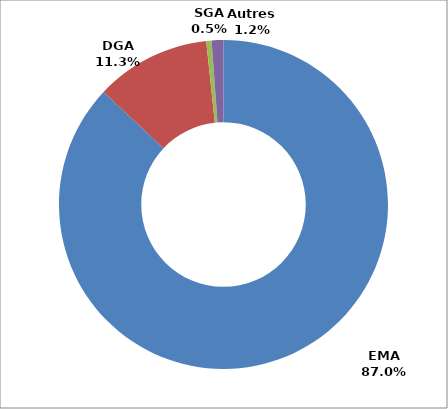
| Category | Series 0 |
|---|---|
| EMA | 226014.797 |
| DGA | 29417.012 |
| SGA | 1355.386 |
| Autres | 3002.063 |